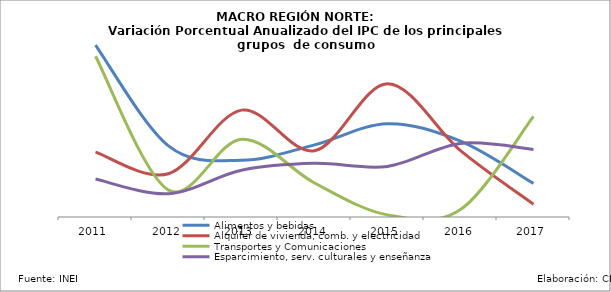
| Category | Alimentos y bebidas | Alquiler de vivienda, comb. y electricidad | Transportes y Comunicaciones | Esparcimiento, serv. culturales y enseñanza |
|---|---|---|---|---|
| 2011.0 | 0.084 | 0.032 | 0.078 | 0.018 |
| 2012.0 | 0.035 | 0.021 | 0.013 | 0.011 |
| 2013.0 | 0.028 | 0.052 | 0.038 | 0.023 |
| 2014.0 | 0.035 | 0.032 | 0.017 | 0.026 |
| 2015.0 | 0.045 | 0.065 | 0.001 | 0.025 |
| 2016.0 | 0.037 | 0.032 | 0.004 | 0.036 |
| 2017.0 | 0.016 | 0.006 | 0.049 | 0.033 |